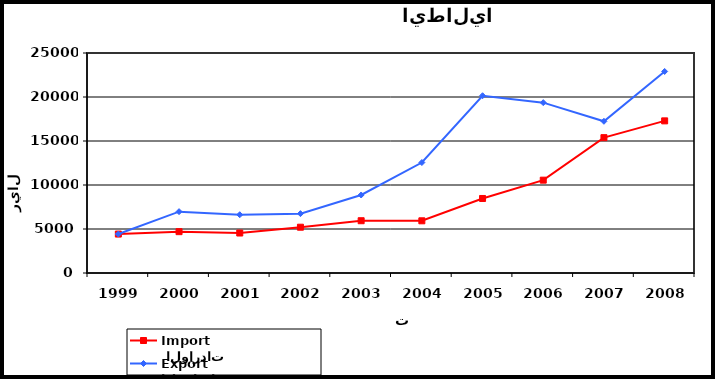
| Category |  الواردات           Import | الصادرات          Export |
|---|---|---|
| 1999.0 | 4424 | 4428 |
| 2000.0 | 4698 | 6971 |
| 2001.0 | 4543 | 6621 |
| 2002.0 | 5203 | 6746 |
| 2003.0 | 5941 | 8865 |
| 2004.0 | 5932 | 12553 |
| 2005.0 | 8468 | 20145 |
| 2006.0 | 10550 | 19359 |
| 2007.0 | 15381 | 17239 |
| 2008.0 | 17288 | 22902 |